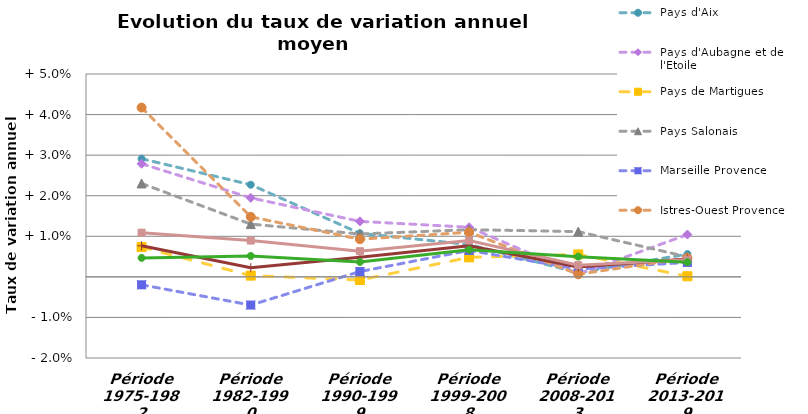
| Category | Pays d'Aix | Pays d'Aubagne et de l'Etoile | Pays de Martigues | Pays Salonais | Marseille Provence | Istres-Ouest Provence | Total Métropole Aix-Marseille Provence | Région Provence-Alpes-Côte-d'Azur | France métropolitaine |
|---|---|---|---|---|---|---|---|---|---|
| Période 1975-1982 | 0.029 | 0.028 | 0.007 | 0.023 | -0.002 | 0.042 | 0.008 | 0.011 | 0.005 |
| Période 1982-1990 | 0.023 | 0.019 | 0 | 0.013 | -0.007 | 0.015 | 0.002 | 0.009 | 0.005 |
| Période 1990-1999 | 0.011 | 0.014 | -0.001 | 0.011 | 0.001 | 0.009 | 0.005 | 0.006 | 0.004 |
| Période 1999-2008 | 0.008 | 0.012 | 0.005 | 0.012 | 0.007 | 0.011 | 0.008 | 0.009 | 0.007 |
| Période 2008-2013 | 0.001 | 0.001 | 0.006 | 0.011 | 0.002 | 0.001 | 0.002 | 0.003 | 0.005 |
| Période 2013-2019 | 0.006 | 0.01 | 0 | 0.005 | 0.004 | 0.005 | 0.004 | 0.004 | 0.004 |